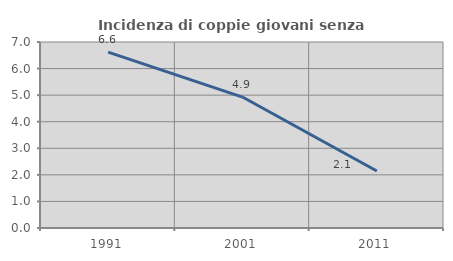
| Category | Incidenza di coppie giovani senza figli |
|---|---|
| 1991.0 | 6.619 |
| 2001.0 | 4.928 |
| 2011.0 | 2.144 |